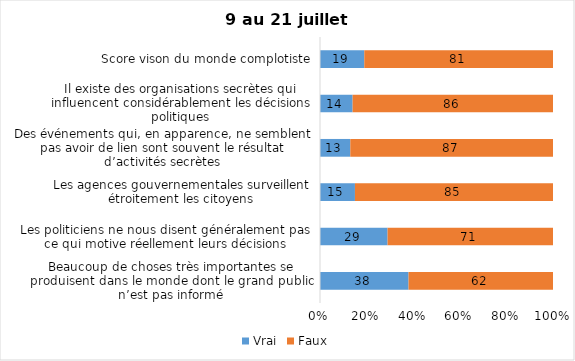
| Category | Vrai | Faux |
|---|---|---|
| Beaucoup de choses très importantes se produisent dans le monde dont le grand public n’est pas informé | 38 | 62 |
| Les politiciens ne nous disent généralement pas ce qui motive réellement leurs décisions | 29 | 71 |
| Les agences gouvernementales surveillent étroitement les citoyens | 15 | 85 |
| Des événements qui, en apparence, ne semblent pas avoir de lien sont souvent le résultat d’activités secrètes | 13 | 87 |
| Il existe des organisations secrètes qui influencent considérablement les décisions politiques | 14 | 86 |
| Score vison du monde complotiste | 19 | 81 |